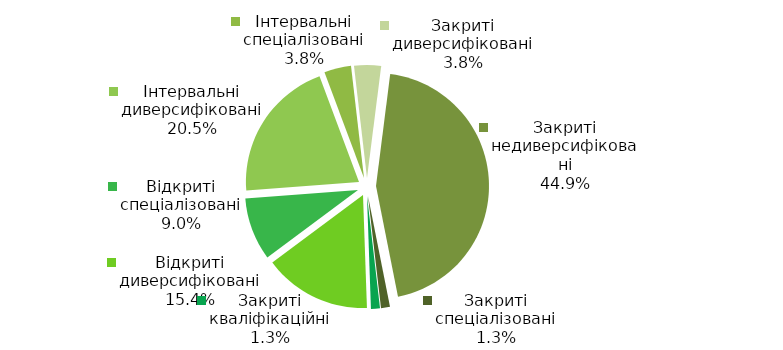
| Category | Series 0 |
|---|---|
| Відкриті диверсифіковані | 12 |
| Відкриті спеціалізовані | 7 |
| Інтервальні диверсифіковані | 16 |
| Інтервальні спеціалізовані | 3 |
| Закриті диверсифіковані | 3 |
| Закриті недиверсифіковані | 35 |
| Закриті спеціалізовані | 1 |
| Закриті кваліфікаційні | 1 |